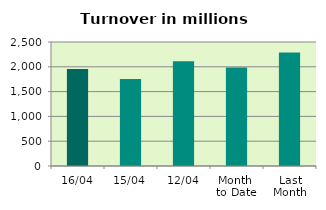
| Category | Series 0 |
|---|---|
| 16/04 | 1953.704 |
| 15/04 | 1751.988 |
| 12/04 | 2113.023 |
| Month 
to Date | 1983.909 |
| Last
Month | 2286.259 |